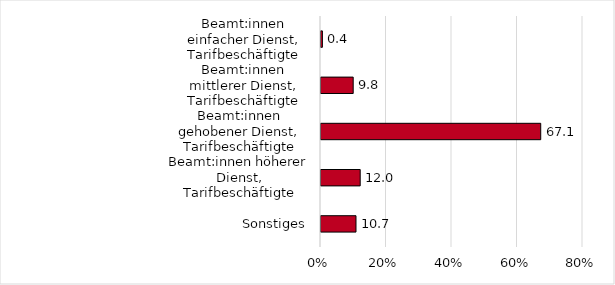
| Category | Series 0 |
|---|---|
| Beamt:innen einfacher Dienst, Tarifbeschäftigte Entgeltgruppe E 1 - E 4 | 0.427 |
| Beamt:innen mittlerer Dienst, Tarifbeschäftigte Entgeltgruppe E 5 - E 9a | 9.829 |
| Beamt:innen gehobener Dienst, Tarifbeschäftigte Entgeltgruppe E 9b - E 12 | 67.094 |
| Beamt:innen höherer Dienst, Tarifbeschäftigte Entgeltgruppe E 13 - E 15 | 11.966 |
| Sonstiges | 10.684 |